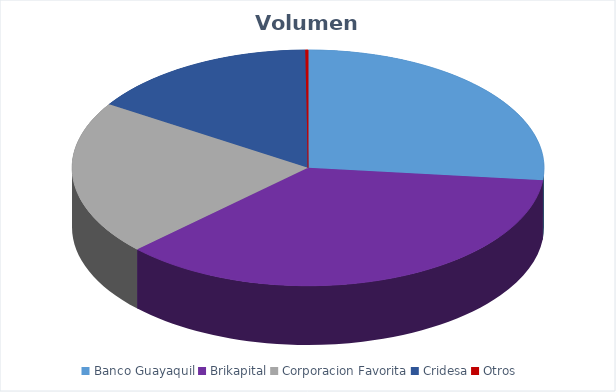
| Category | VOLUMEN ($USD) |
|---|---|
| Banco Guayaquil | 22105.72 |
| Brikapital | 30000 |
| Corporacion Favorita | 17575.36 |
| Cridesa | 13050 |
| Otros | 154.1 |